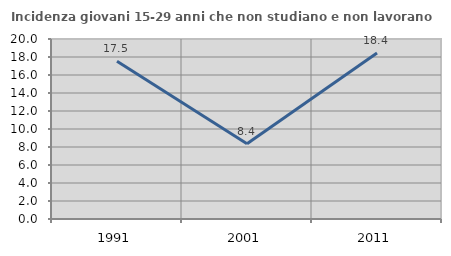
| Category | Incidenza giovani 15-29 anni che non studiano e non lavorano  |
|---|---|
| 1991.0 | 17.536 |
| 2001.0 | 8.362 |
| 2011.0 | 18.443 |